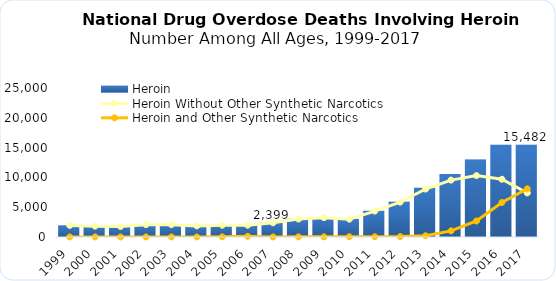
| Category | Heroin |
|---|---|
| 1999.0 | 1960 |
| 2000.0 | 1842 |
| 2001.0 | 1779 |
| 2002.0 | 2089 |
| 2003.0 | 2080 |
| 2004.0 | 1878 |
| 2005.0 | 2009 |
| 2006.0 | 2088 |
| 2007.0 | 2399 |
| 2008.0 | 3041 |
| 2009.0 | 3278 |
| 2010.0 | 3036 |
| 2011.0 | 4397 |
| 2012.0 | 5925 |
| 2013.0 | 8257 |
| 2014.0 | 10574 |
| 2015.0 | 12989 |
| 2016.0 | 15469 |
| 2017.0 | 15482 |